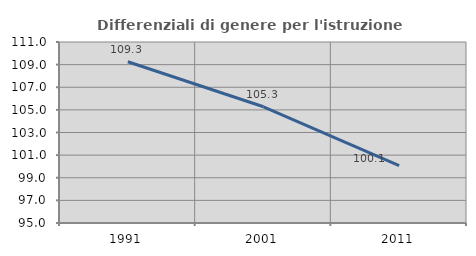
| Category | Differenziali di genere per l'istruzione superiore |
|---|---|
| 1991.0 | 109.25 |
| 2001.0 | 105.273 |
| 2011.0 | 100.076 |